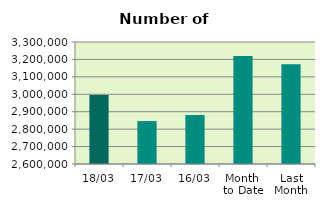
| Category | Series 0 |
|---|---|
| 18/03 | 2996048 |
| 17/03 | 2846356 |
| 16/03 | 2881134 |
| Month 
to Date | 3220348.571 |
| Last
Month | 3172414.4 |